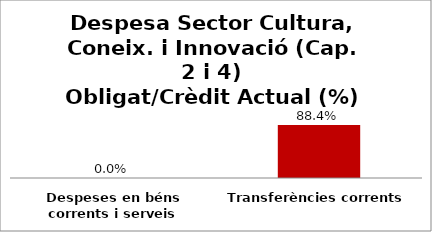
| Category | Series 0 |
|---|---|
| Despeses en béns corrents i serveis | 0 |
| Transferències corrents | 0.884 |